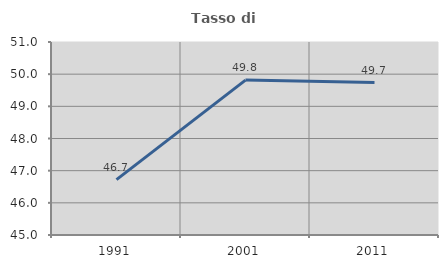
| Category | Tasso di occupazione   |
|---|---|
| 1991.0 | 46.72 |
| 2001.0 | 49.816 |
| 2011.0 | 49.739 |